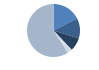
| Category | Series 0 |
|---|---|
| ARRASTRE | 227 |
| CERCO | 159 |
| PALANGRE | 105 |
| REDES DE ENMALLE | 39 |
| ARTES MENORES | 763 |
| SIN TIPO ASIGNADO | 1 |